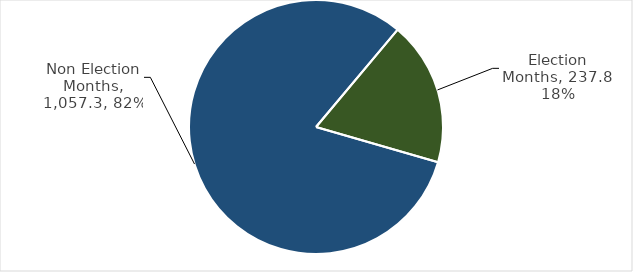
| Category | Total Grants |
|---|---|
| Election Months | 237.763 |
| Non Election Months | 1057.328 |